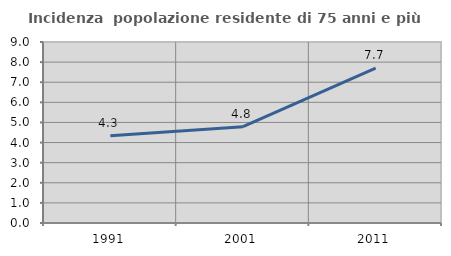
| Category | Incidenza  popolazione residente di 75 anni e più |
|---|---|
| 1991.0 | 4.333 |
| 2001.0 | 4.79 |
| 2011.0 | 7.705 |